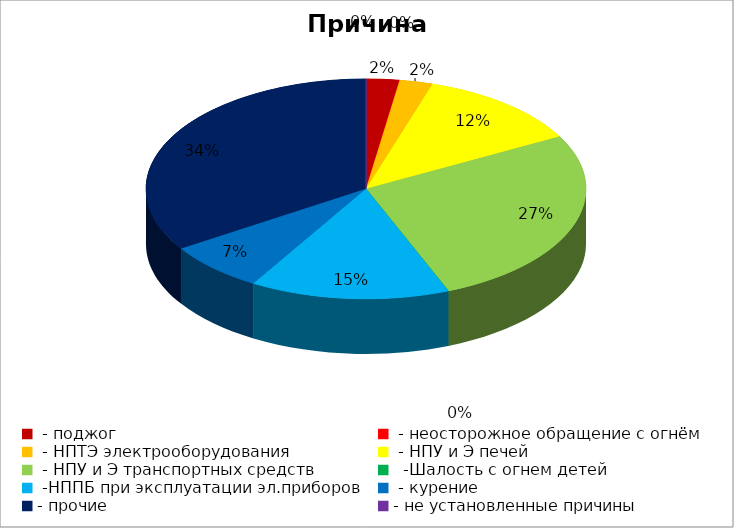
| Category | Причина пожара |
|---|---|
|  - поджог | 1 |
|  - неосторожное обращение с огнём | 0 |
|  - НПТЭ электрооборудования | 1 |
|  - НПУ и Э печей | 5 |
|  - НПУ и Э транспортных средств | 11 |
|   -Шалость с огнем детей | 0 |
|  -НППБ при эксплуатации эл.приборов | 6 |
|  - курение | 3 |
| - прочие | 14 |
| - не установленные причины | 0 |